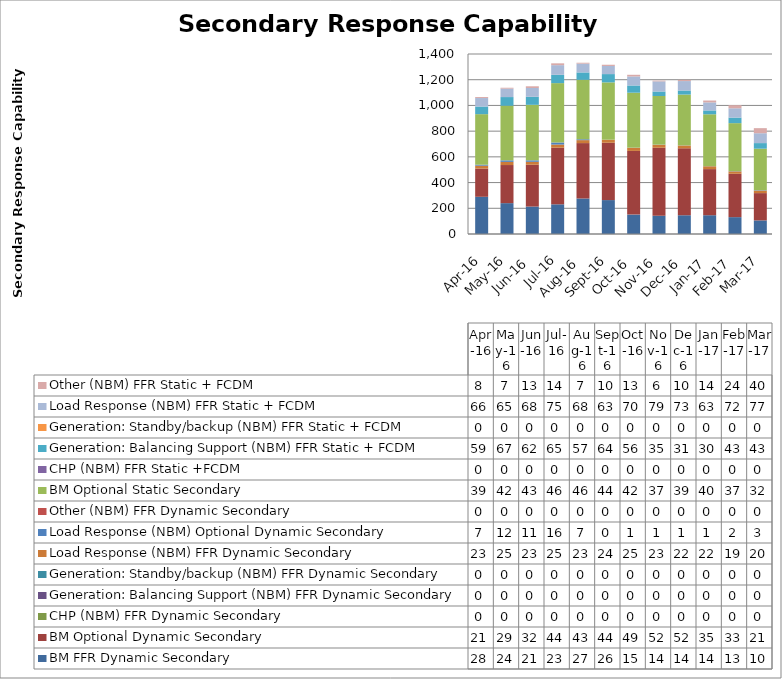
| Category | BM FFR Dynamic Secondary | BM Optional Dynamic Secondary | CHP (NBM) FFR Dynamic Secondary | Generation: Balancing Support (NBM) FFR Dynamic Secondary | Generation: Standby/backup (NBM) FFR Dynamic Secondary | Load Response (NBM) FFR Dynamic Secondary | Load Response (NBM) Optional Dynamic Secondary | Other (NBM) FFR Dynamic Secondary | BM Optional Static Secondary | CHP (NBM) FFR Static +FCDM | Generation: Balancing Support (NBM) FFR Static + FCDM | Generation: Standby/backup (NBM) FFR Static + FCDM | Load Response (NBM) FFR Static + FCDM | Other (NBM) FFR Static + FCDM |
|---|---|---|---|---|---|---|---|---|---|---|---|---|---|---|
| 2016-04-01 | 289.338 | 219.121 | 0 | 0 | 0 | 22.968 | 7.444 | 0 | 393.156 | 0 | 59.362 | 0 | 66.071 | 7.704 |
| 2016-05-01 | 239.985 | 296.416 | 0 | 0 | 0 | 24.552 | 11.825 | 0 | 425.169 | 0 | 67.102 | 0 | 65.495 | 7.016 |
| 2016-06-01 | 213.407 | 325.179 | 0 | 0 | 0 | 22.968 | 11.392 | 0 | 431.842 | 0 | 62.336 | 0 | 68.285 | 13.46 |
| 2016-07-01 | 230.779 | 440.373 | 0 | 0 | 0 | 24.552 | 16.07 | 0 | 461.747 | 0 | 64.617 | 0 | 75.037 | 14.266 |
| 2016-08-01 | 276.276 | 430.832 | 0 | 0 | 0 | 22.968 | 6.765 | 0 | 462.602 | 0 | 57.201 | 0 | 68.382 | 6.998 |
| 2016-09-01 | 263.829 | 445.773 | 0 | 0 | 0 | 23.76 | 0.072 | 0 | 445.89 | 0 | 64.447 | 0 | 63.125 | 9.583 |
| 2016-10-01 | 151.036 | 495.025 | 0 | 0 | 0 | 24.585 | 0.884 | 0 | 427.448 | 0 | 56.118 | 0 | 70.377 | 12.8 |
| 2016-11-01 | 141.872 | 528.878 | 0 | 0 | 0 | 22.968 | 1.413 | 0 | 378.174 | 0 | 35.052 | 0 | 78.825 | 5.94 |
| 2016-12-01 | 145.821 | 520.463 | 0 | 0 | 0 | 22.176 | 0.821 | 0 | 395.322 | 0 | 31.43 | 0 | 73.455 | 9.5 |
| 2017-01-01 | 145.997 | 358.708 | 0 | 0 | 0 | 22.176 | 0.636 | 0 | 403.608 | 0 | 29.94 | 0 | 62.6 | 14.47 |
| 2017-02-01 | 131.118 | 337.043 | 0 | 0 | 0 | 19.008 | 1.832 | 0 | 373.208 | 0 | 43.122 | 0 | 72.4 | 24.011 |
| 2017-03-01 | 105.759 | 212.291 | 0 | 0 | 0 | 19.767 | 2.883 | 0 | 322.89 | 0 | 43.458 | 0 | 76.697 | 39.523 |